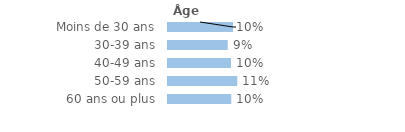
| Category | Series 0 |
|---|---|
| Moins de 30 ans | 0.103 |
| 30-39 ans | 0.095 |
| 40-49 ans | 0.1 |
| 50-59 ans | 0.11 |
| 60 ans ou plus | 0.1 |